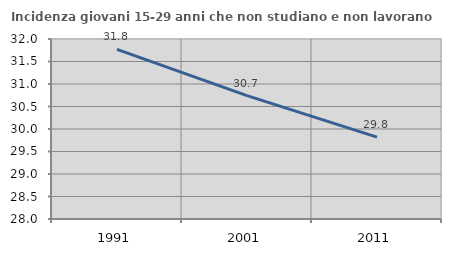
| Category | Incidenza giovani 15-29 anni che non studiano e non lavorano  |
|---|---|
| 1991.0 | 31.769 |
| 2001.0 | 30.743 |
| 2011.0 | 29.821 |